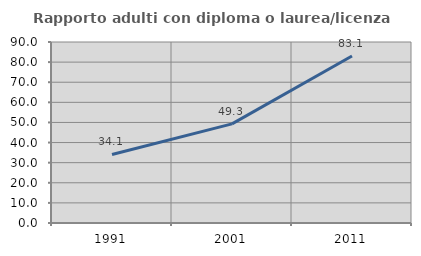
| Category | Rapporto adulti con diploma o laurea/licenza media  |
|---|---|
| 1991.0 | 34.091 |
| 2001.0 | 49.266 |
| 2011.0 | 83.055 |